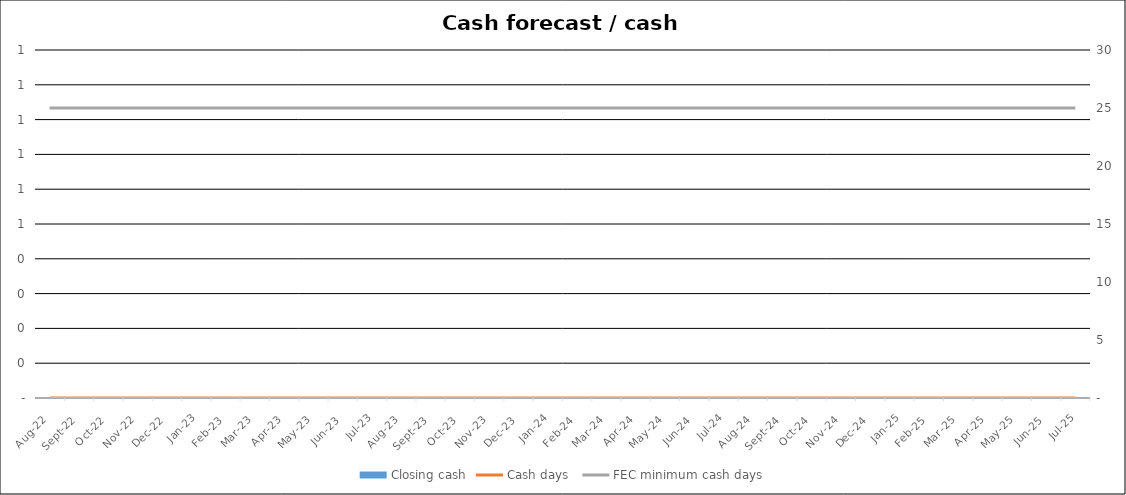
| Category | Closing cash |
|---|---|
| 2022-08-31 | 0 |
| 2022-09-30 | 0 |
| 2022-10-31 | 0 |
| 2022-11-30 | 0 |
| 2022-12-31 | 0 |
| 2023-01-31 | 0 |
| 2023-02-28 | 0 |
| 2023-03-31 | 0 |
| 2023-04-30 | 0 |
| 2023-05-31 | 0 |
| 2023-06-30 | 0 |
| 2023-07-31 | 0 |
| 2023-08-31 | 0 |
| 2023-09-30 | 0 |
| 2023-10-31 | 0 |
| 2023-11-30 | 0 |
| 2023-12-31 | 0 |
| 2024-01-31 | 0 |
| 2024-02-29 | 0 |
| 2024-03-31 | 0 |
| 2024-04-30 | 0 |
| 2024-05-31 | 0 |
| 2024-06-30 | 0 |
| 2024-07-31 | 0 |
| 2024-08-31 | 0 |
| 2024-09-30 | 0 |
| 2024-10-31 | 0 |
| 2024-11-30 | 0 |
| 2024-12-31 | 0 |
| 2025-01-31 | 0 |
| 2025-02-28 | 0 |
| 2025-03-31 | 0 |
| 2025-04-30 | 0 |
| 2025-05-31 | 0 |
| 2025-06-30 | 0 |
| 2025-07-31 | 0 |